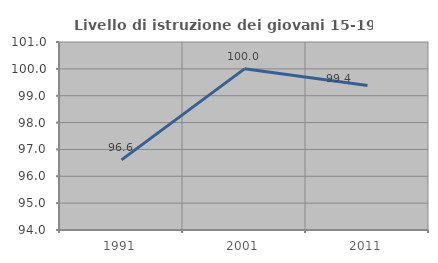
| Category | Livello di istruzione dei giovani 15-19 anni |
|---|---|
| 1991.0 | 96.61 |
| 2001.0 | 100 |
| 2011.0 | 99.383 |